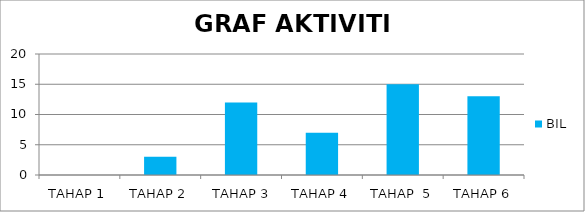
| Category | BIL |
|---|---|
| TAHAP 1 | 0 |
| TAHAP 2 | 3 |
|  TAHAP 3 | 12 |
| TAHAP 4 | 7 |
| TAHAP  5 | 15 |
| TAHAP 6 | 13 |